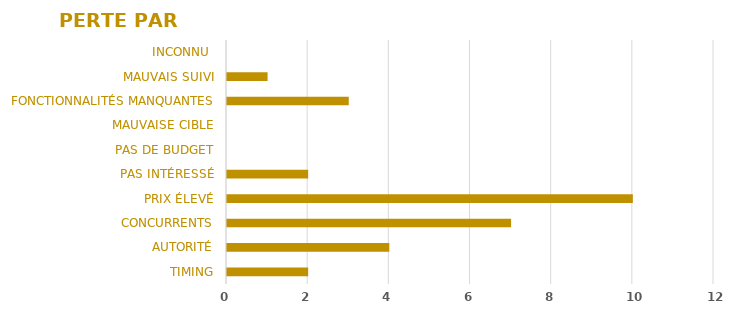
| Category | Series 0 |
|---|---|
| TIMING | 2 |
| AUTORITÉ | 4 |
| CONCURRENTS | 7 |
| PRIX ÉLEVÉ | 10 |
| PAS INTÉRESSÉ | 2 |
| PAS DE BUDGET | 0 |
| MAUVAISE CIBLE | 0 |
| FONCTIONNALITÉS MANQUANTES | 3 |
| MAUVAIS SUIVI | 1 |
| INCONNU  | 0 |